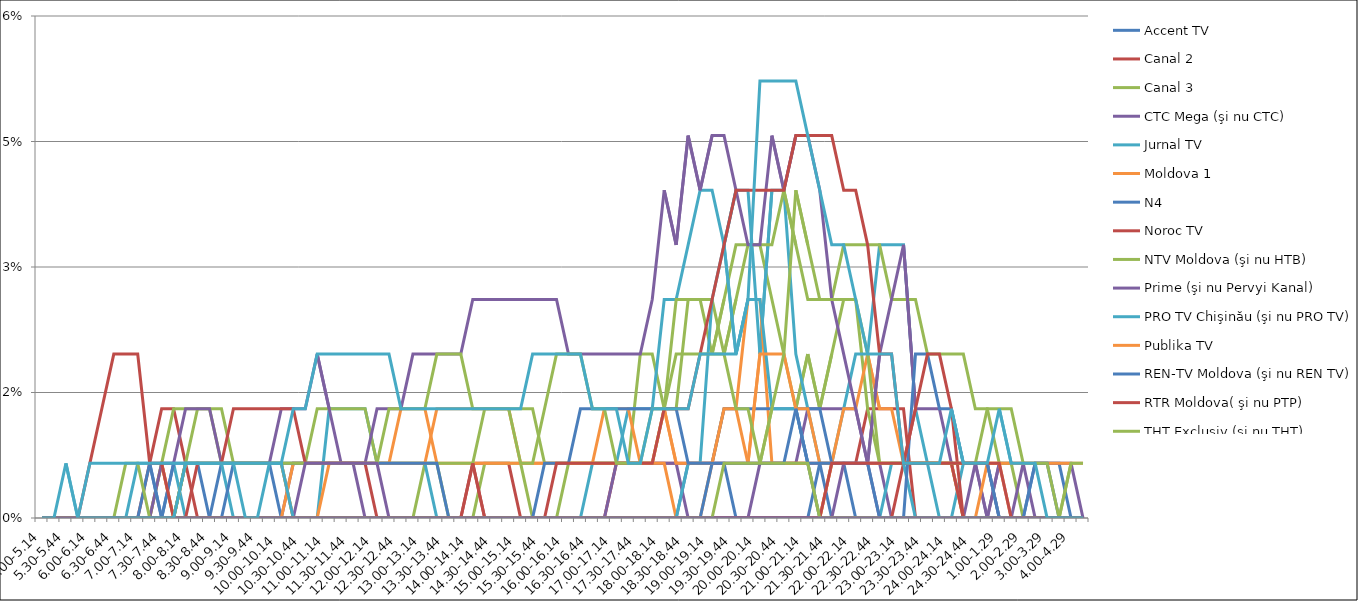
| Category | Accent TV | Canal 2 | Canal 3 | CTC Mega (şi nu CTC) | Jurnal TV | Moldova 1 | N4 | Noroc TV | NTV Moldova (şi nu HTB) | Prime (şi nu Pervyi Kanal) | PRO TV Chişinău (şi nu PRO TV) | Publika TV  | REN-TV Moldova (şi nu REN TV)  | RTR Moldova( şi nu PTP)  | THT Exclusiv (şi nu THT) | TV8 | TVC 21 | TVR MOLDOVA (şi nu TVR) | Canal Regional | Familia Domashniy | ITV | Moldova 2 | Alt canal |
|---|---|---|---|---|---|---|---|---|---|---|---|---|---|---|---|---|---|---|---|---|---|---|---|
| 5.00-5.14 | 0 | 0 | 0 | 0 | 0 | 0 | 0 | 0 | 0 | 0 | 0 | 0 | 0 | 0 | 0 | 0 | 0 | 0 | 0 | 0 | 0 | 0 | 0 |
| 5.15-5.29 | 0 | 0 | 0 | 0 | 0 | 0 | 0 | 0 | 0 | 0 | 0 | 0 | 0 | 0 | 0 | 0 | 0 | 0 | 0 | 0 | 0 | 0 | 0 |
| 5.30-5.44 | 0 | 0 | 0 | 0 | 0 | 0 | 0 | 0 | 0 | 0 | 0 | 0 | 0 | 0 | 0 | 0 | 0 | 0 | 0 | 0 | 0 | 0 | 0.007 |
| 5.45-5.59 | 0 | 0 | 0 | 0 | 0 | 0 | 0 | 0 | 0 | 0 | 0 | 0 | 0 | 0 | 0 | 0 | 0 | 0 | 0 | 0 | 0 | 0 | 0 |
| 6.00-6.14 | 0 | 0 | 0 | 0 | 0 | 0 | 0 | 0 | 0 | 0 | 0 | 0 | 0 | 0.007 | 0 | 0 | 0.007 | 0 | 0 | 0 | 0 | 0 | 0 |
| 6.15-6.29 | 0 | 0 | 0 | 0 | 0 | 0 | 0 | 0 | 0 | 0 | 0 | 0 | 0 | 0.013 | 0 | 0 | 0.007 | 0 | 0 | 0 | 0 | 0 | 0 |
| 6.30-6.44 | 0 | 0 | 0 | 0 | 0 | 0 | 0 | 0 | 0 | 0 | 0 | 0 | 0 | 0.02 | 0 | 0 | 0.007 | 0 | 0 | 0 | 0 | 0 | 0 |
| 6.45-6.59 | 0 | 0 | 0 | 0 | 0 | 0 | 0 | 0 | 0 | 0 | 0 | 0 | 0 | 0.02 | 0.007 | 0 | 0.007 | 0 | 0 | 0 | 0 | 0 | 0 |
| 7.00-7.14 | 0 | 0 | 0 | 0 | 0.007 | 0 | 0 | 0 | 0 | 0 | 0 | 0 | 0 | 0.02 | 0.007 | 0 | 0.007 | 0 | 0 | 0 | 0 | 0 | 0 |
| 7.15-7.29 | 0 | 0.007 | 0 | 0 | 0.007 | 0 | 0 | 0 | 0 | 0 | 0 | 0 | 0.007 | 0.007 | 0 | 0 | 0.007 | 0 | 0 | 0 | 0 | 0 | 0 |
| 7.30-7.44 | 0 | 0.013 | 0 | 0 | 0.007 | 0.007 | 0 | 0 | 0.007 | 0.007 | 0 | 0 | 0 | 0.007 | 0 | 0 | 0.007 | 0 | 0 | 0 | 0 | 0 | 0 |
| 7.45-7.59 | 0 | 0.013 | 0 | 0 | 0.007 | 0 | 0 | 0 | 0.013 | 0.007 | 0 | 0 | 0.007 | 0 | 0 | 0 | 0.007 | 0 | 0 | 0 | 0 | 0 | 0 |
| 8.00-8.14 | 0 | 0.007 | 0.007 | 0 | 0 | 0.007 | 0 | 0 | 0.013 | 0.013 | 0.007 | 0 | 0.007 | 0 | 0.007 | 0 | 0.007 | 0 | 0 | 0 | 0 | 0 | 0.007 |
| 8.15-8.29 | 0 | 0 | 0.013 | 0 | 0 | 0.007 | 0 | 0 | 0.013 | 0.013 | 0.007 | 0 | 0.007 | 0.007 | 0.007 | 0 | 0.007 | 0 | 0 | 0 | 0 | 0 | 0.007 |
| 8.30-8.44 | 0 | 0 | 0.013 | 0 | 0 | 0.007 | 0 | 0 | 0.013 | 0.013 | 0.007 | 0 | 0 | 0.007 | 0.007 | 0 | 0.007 | 0 | 0 | 0 | 0 | 0 | 0.007 |
| 8.45-8.59 | 0 | 0 | 0.007 | 0 | 0 | 0.007 | 0.007 | 0 | 0.013 | 0.007 | 0.007 | 0 | 0 | 0.007 | 0.007 | 0 | 0.007 | 0 | 0 | 0 | 0 | 0 | 0.007 |
| 9.00-9.14 | 0 | 0 | 0.007 | 0 | 0 | 0.007 | 0.007 | 0 | 0.007 | 0.007 | 0 | 0 | 0.007 | 0.013 | 0.007 | 0 | 0.007 | 0 | 0 | 0 | 0 | 0 | 0.007 |
| 9.15-9.29 | 0 | 0 | 0.007 | 0 | 0 | 0.007 | 0.007 | 0 | 0.007 | 0.007 | 0 | 0 | 0.007 | 0.013 | 0.007 | 0 | 0.007 | 0 | 0 | 0 | 0 | 0 | 0 |
| 9.30-9.44 | 0 | 0 | 0.007 | 0 | 0 | 0.007 | 0.007 | 0 | 0.007 | 0.007 | 0 | 0 | 0.007 | 0.013 | 0.007 | 0 | 0.007 | 0 | 0 | 0 | 0 | 0 | 0 |
| 9.45-9.59 | 0 | 0 | 0.007 | 0 | 0 | 0.007 | 0.007 | 0 | 0.007 | 0.007 | 0 | 0 | 0.007 | 0.013 | 0.007 | 0 | 0.007 | 0 | 0 | 0 | 0 | 0 | 0.007 |
| 10.00-10.14 | 0 | 0 | 0.007 | 0 | 0 | 0.007 | 0 | 0 | 0.007 | 0.013 | 0 | 0 | 0.007 | 0.013 | 0.007 | 0 | 0.007 | 0 | 0 | 0 | 0 | 0 | 0.007 |
| 10.15-10.29 | 0 | 0 | 0 | 0.007 | 0 | 0 | 0 | 0 | 0.007 | 0.013 | 0 | 0.007 | 0.007 | 0.013 | 0.007 | 0 | 0 | 0 | 0 | 0 | 0 | 0 | 0.013 |
| 10.30-10.44 | 0 | 0 | 0 | 0.007 | 0 | 0 | 0 | 0 | 0.007 | 0.013 | 0 | 0.007 | 0.007 | 0.007 | 0.007 | 0.007 | 0 | 0 | 0 | 0 | 0 | 0 | 0.013 |
| 10.45-10.59 | 0 | 0 | 0 | 0.007 | 0 | 0 | 0 | 0 | 0.013 | 0.02 | 0 | 0.007 | 0.007 | 0.007 | 0.007 | 0.007 | 0 | 0 | 0 | 0 | 0 | 0 | 0.02 |
| 11.00-11.14 | 0 | 0 | 0 | 0.007 | 0.013 | 0.007 | 0 | 0 | 0.013 | 0.013 | 0 | 0.007 | 0.007 | 0.007 | 0.007 | 0.007 | 0 | 0 | 0 | 0 | 0 | 0 | 0.02 |
| 11.15-11.29 | 0 | 0 | 0 | 0.007 | 0.013 | 0.007 | 0 | 0 | 0.013 | 0.007 | 0 | 0.007 | 0.007 | 0.007 | 0.007 | 0.007 | 0 | 0 | 0 | 0 | 0 | 0 | 0.02 |
| 11.30-11.44 | 0 | 0 | 0 | 0.007 | 0.013 | 0.007 | 0 | 0 | 0.013 | 0.007 | 0 | 0.007 | 0.007 | 0.007 | 0.007 | 0.007 | 0 | 0 | 0 | 0 | 0 | 0 | 0.02 |
| 11.45-11.59 | 0 | 0 | 0 | 0 | 0.013 | 0.007 | 0 | 0 | 0.013 | 0.007 | 0 | 0.007 | 0.007 | 0.007 | 0.007 | 0.007 | 0 | 0 | 0 | 0 | 0 | 0 | 0.02 |
| 12.00-12.14 | 0 | 0 | 0 | 0 | 0.007 | 0.007 | 0 | 0 | 0.007 | 0.013 | 0 | 0.007 | 0.007 | 0 | 0.007 | 0.007 | 0 | 0 | 0 | 0 | 0 | 0 | 0.02 |
| 12.15-12.29 | 0 | 0 | 0 | 0 | 0.007 | 0.007 | 0 | 0 | 0.007 | 0.013 | 0 | 0.007 | 0.007 | 0 | 0.013 | 0 | 0 | 0 | 0 | 0 | 0 | 0 | 0.02 |
| 12.30-12.44 | 0 | 0 | 0 | 0 | 0.007 | 0.013 | 0 | 0 | 0.007 | 0.013 | 0 | 0.007 | 0.007 | 0 | 0.013 | 0 | 0 | 0 | 0 | 0 | 0 | 0 | 0.013 |
| 12.45-12.59 | 0 | 0 | 0 | 0 | 0.007 | 0.013 | 0 | 0 | 0.007 | 0.02 | 0 | 0.007 | 0.007 | 0 | 0.013 | 0 | 0 | 0 | 0 | 0 | 0 | 0 | 0.013 |
| 13.00-13.14 | 0 | 0 | 0.007 | 0 | 0.007 | 0.013 | 0 | 0 | 0.007 | 0.02 | 0 | 0.007 | 0.007 | 0 | 0.013 | 0 | 0 | 0 | 0 | 0 | 0 | 0 | 0.013 |
| 13.15-13.29 | 0 | 0 | 0.007 | 0 | 0 | 0.007 | 0 | 0 | 0.007 | 0.02 | 0 | 0.013 | 0.007 | 0 | 0.02 | 0 | 0 | 0 | 0 | 0 | 0 | 0 | 0.013 |
| 13.30-13.44 | 0 | 0 | 0 | 0 | 0 | 0.007 | 0 | 0 | 0.007 | 0.02 | 0 | 0.013 | 0 | 0 | 0.02 | 0 | 0 | 0 | 0 | 0 | 0 | 0 | 0.013 |
| 13.45-13.59 | 0 | 0 | 0 | 0 | 0 | 0.007 | 0 | 0 | 0.007 | 0.02 | 0 | 0.013 | 0 | 0 | 0.02 | 0 | 0 | 0 | 0 | 0 | 0 | 0 | 0.013 |
| 14.00-14.14 | 0 | 0.007 | 0 | 0 | 0 | 0.007 | 0 | 0 | 0.007 | 0.026 | 0 | 0.013 | 0 | 0.007 | 0.013 | 0 | 0 | 0 | 0 | 0 | 0 | 0 | 0.013 |
| 14.15-14.29 | 0 | 0.007 | 0.007 | 0 | 0 | 0.007 | 0 | 0 | 0.013 | 0.026 | 0 | 0.013 | 0 | 0 | 0.013 | 0 | 0 | 0 | 0 | 0 | 0 | 0 | 0.013 |
| 14.30-14.44 | 0 | 0.007 | 0.007 | 0 | 0 | 0.007 | 0 | 0 | 0.013 | 0.026 | 0 | 0.013 | 0 | 0 | 0.013 | 0 | 0 | 0 | 0 | 0 | 0 | 0 | 0.013 |
| 14.45-14.59 | 0 | 0.007 | 0.007 | 0 | 0 | 0.007 | 0 | 0 | 0.013 | 0.026 | 0 | 0.013 | 0 | 0 | 0.013 | 0 | 0 | 0 | 0 | 0 | 0 | 0 | 0.013 |
| 15.00-15.14 | 0 | 0 | 0.007 | 0 | 0 | 0.007 | 0 | 0 | 0.013 | 0.026 | 0 | 0.007 | 0 | 0 | 0.007 | 0 | 0 | 0 | 0 | 0 | 0 | 0 | 0.013 |
| 15.15-15.29 | 0 | 0 | 0 | 0 | 0 | 0.007 | 0 | 0 | 0.013 | 0.026 | 0 | 0.007 | 0 | 0 | 0.007 | 0 | 0 | 0 | 0 | 0 | 0 | 0 | 0.02 |
| 15.30-15.44 | 0 | 0 | 0 | 0 | 0 | 0.007 | 0 | 0 | 0.007 | 0.026 | 0 | 0.007 | 0.007 | 0 | 0.013 | 0 | 0 | 0 | 0 | 0 | 0 | 0 | 0.02 |
| 15.45-15.59 | 0 | 0 | 0 | 0 | 0 | 0.007 | 0 | 0 | 0.007 | 0.026 | 0 | 0.007 | 0.007 | 0.007 | 0.02 | 0 | 0 | 0 | 0 | 0 | 0 | 0 | 0.02 |
| 16.00-16.14 | 0 | 0 | 0.007 | 0 | 0 | 0.007 | 0 | 0 | 0.007 | 0.02 | 0 | 0.007 | 0.007 | 0.007 | 0.02 | 0 | 0 | 0 | 0 | 0 | 0 | 0 | 0.02 |
| 16.15-16.29 | 0 | 0 | 0.007 | 0 | 0 | 0.007 | 0 | 0 | 0.007 | 0.02 | 0 | 0.007 | 0.013 | 0.007 | 0.02 | 0 | 0 | 0 | 0 | 0 | 0 | 0 | 0.02 |
| 16.30-16.44 | 0 | 0 | 0.007 | 0 | 0.007 | 0.007 | 0 | 0 | 0.007 | 0.02 | 0 | 0.007 | 0.013 | 0.007 | 0.013 | 0 | 0 | 0 | 0 | 0 | 0 | 0 | 0.013 |
| 16.45-16.59 | 0 | 0 | 0.007 | 0 | 0.007 | 0.013 | 0 | 0 | 0.007 | 0.02 | 0 | 0.007 | 0.013 | 0.007 | 0.013 | 0 | 0 | 0 | 0 | 0 | 0 | 0 | 0.013 |
| 17.00-17.14 | 0 | 0.007 | 0.007 | 0.007 | 0.007 | 0.013 | 0 | 0 | 0.007 | 0.02 | 0 | 0.007 | 0.013 | 0.007 | 0.007 | 0 | 0 | 0 | 0 | 0 | 0 | 0 | 0.013 |
| 17.15-17.29 | 0 | 0.007 | 0.007 | 0.007 | 0.013 | 0.013 | 0 | 0 | 0.007 | 0.02 | 0 | 0.007 | 0.013 | 0.007 | 0.007 | 0 | 0 | 0 | 0 | 0 | 0 | 0 | 0.007 |
| 17.30-17.44 | 0 | 0.007 | 0.02 | 0.007 | 0.013 | 0.007 | 0 | 0 | 0.007 | 0.02 | 0 | 0.007 | 0.013 | 0.007 | 0.007 | 0 | 0 | 0 | 0 | 0 | 0 | 0 | 0.007 |
| 17.45-17.59 | 0 | 0.007 | 0.02 | 0.007 | 0.013 | 0.007 | 0 | 0 | 0.007 | 0.026 | 0 | 0.007 | 0.013 | 0.007 | 0.013 | 0 | 0 | 0 | 0 | 0 | 0 | 0 | 0.013 |
| 18.00-18.14 | 0 | 0.007 | 0.013 | 0.007 | 0.026 | 0.007 | 0 | 0 | 0.013 | 0.039 | 0 | 0.013 | 0.013 | 0.013 | 0.013 | 0 | 0 | 0 | 0 | 0 | 0 | 0 | 0.013 |
| 18.15-18.29 | 0 | 0.007 | 0.013 | 0.007 | 0.026 | 0 | 0 | 0 | 0.026 | 0.033 | 0 | 0.007 | 0.013 | 0.013 | 0.02 | 0 | 0 | 0 | 0 | 0 | 0 | 0 | 0.013 |
| 18.30-18.44 | 0.007 | 0.007 | 0.026 | 0 | 0.033 | 0 | 0 | 0 | 0.026 | 0.046 | 0.007 | 0.007 | 0.007 | 0.013 | 0.02 | 0 | 0 | 0 | 0 | 0 | 0 | 0 | 0.013 |
| 18.45-18.59 | 0.007 | 0.007 | 0.026 | 0 | 0.039 | 0 | 0 | 0 | 0.026 | 0.039 | 0.007 | 0.007 | 0.007 | 0.02 | 0.02 | 0 | 0 | 0 | 0 | 0 | 0 | 0 | 0.02 |
| 19.00-19.14 | 0.007 | 0.007 | 0.026 | 0 | 0.039 | 0.007 | 0.007 | 0 | 0.02 | 0.046 | 0.026 | 0.007 | 0.007 | 0.026 | 0.02 | 0 | 0 | 0 | 0 | 0 | 0 | 0 | 0.02 |
| 19.15-19.29 | 0.007 | 0.007 | 0.02 | 0 | 0.033 | 0.013 | 0.013 | 0 | 0.026 | 0.046 | 0.033 | 0.013 | 0.007 | 0.033 | 0.02 | 0 | 0 | 0 | 0 | 0 | 0.007 | 0 | 0.02 |
| 19.30-19.44 | 0 | 0.007 | 0.026 | 0 | 0.039 | 0.013 | 0.013 | 0 | 0.033 | 0.039 | 0.02 | 0.013 | 0.007 | 0.039 | 0.013 | 0 | 0 | 0 | 0 | 0 | 0.007 | 0 | 0.02 |
| 19.45-19.59 | 0 | 0.007 | 0.033 | 0 | 0.039 | 0.026 | 0.013 | 0 | 0.033 | 0.033 | 0.026 | 0.007 | 0.007 | 0.039 | 0.013 | 0 | 0 | 0 | 0 | 0 | 0.007 | 0 | 0.026 |
| 20.00-20.14 | 0 | 0.007 | 0.033 | 0.007 | 0.02 | 0.026 | 0.013 | 0 | 0.033 | 0.033 | 0.026 | 0.02 | 0.007 | 0.039 | 0.007 | 0 | 0 | 0 | 0 | 0 | 0.007 | 0 | 0.052 |
| 20.15-20.29 | 0 | 0.007 | 0.026 | 0.007 | 0.039 | 0.007 | 0.013 | 0 | 0.033 | 0.046 | 0.013 | 0.02 | 0.007 | 0.039 | 0.013 | 0 | 0 | 0 | 0 | 0 | 0.007 | 0 | 0.052 |
| 20.30-20.44 | 0 | 0.007 | 0.02 | 0.007 | 0.039 | 0.007 | 0.013 | 0 | 0.039 | 0.039 | 0.013 | 0.02 | 0.007 | 0.039 | 0.02 | 0 | 0 | 0 | 0 | 0 | 0.007 | 0 | 0.052 |
| 20.45-20.59 | 0 | 0.007 | 0.013 | 0.007 | 0.02 | 0.007 | 0.013 | 0 | 0.033 | 0.046 | 0.013 | 0.013 | 0.013 | 0.046 | 0.039 | 0 | 0 | 0 | 0 | 0 | 0.007 | 0 | 0.052 |
| 21.00-21.14 | 0 | 0.007 | 0.02 | 0.013 | 0.013 | 0.007 | 0.013 | 0 | 0.026 | 0.046 | 0.007 | 0.013 | 0.007 | 0.046 | 0.033 | 0 | 0 | 0 | 0 | 0 | 0.007 | 0 | 0.046 |
| 21.15-21.29 | 0 | 0.007 | 0.013 | 0.013 | 0.007 | 0 | 0.013 | 0 | 0.026 | 0.039 | 0 | 0.007 | 0.007 | 0.046 | 0.026 | 0 | 0 | 0 | 0.007 | 0 | 0 | 0 | 0.039 |
| 21.30-21.44 | 0 | 0.007 | 0.02 | 0.013 | 0.007 | 0.007 | 0.007 | 0 | 0.026 | 0.026 | 0 | 0.007 | 0 | 0.046 | 0.026 | 0 | 0 | 0 | 0.007 | 0.007 | 0 | 0 | 0.033 |
| 21.45-21.59 | 0 | 0.007 | 0.026 | 0.013 | 0.013 | 0.013 | 0.007 | 0 | 0.033 | 0.02 | 0 | 0.007 | 0 | 0.039 | 0.026 | 0.007 | 0 | 0 | 0.007 | 0.007 | 0 | 0 | 0.033 |
| 22.00-22.14 | 0 | 0.007 | 0.026 | 0.013 | 0.02 | 0.013 | 0 | 0 | 0.033 | 0.013 | 0 | 0.007 | 0 | 0.039 | 0.026 | 0.007 | 0 | 0 | 0.007 | 0.007 | 0 | 0 | 0.026 |
| 22.15-22.29 | 0 | 0.013 | 0.013 | 0.007 | 0.02 | 0.02 | 0 | 0 | 0.033 | 0.007 | 0 | 0.007 | 0 | 0.033 | 0.02 | 0.007 | 0 | 0 | 0.007 | 0.007 | 0 | 0 | 0.02 |
| 22.30-22.44 | 0 | 0.013 | 0.007 | 0.007 | 0.033 | 0.013 | 0 | 0 | 0.033 | 0.02 | 0 | 0.007 | 0 | 0.02 | 0.007 | 0 | 0 | 0 | 0 | 0.007 | 0 | 0 | 0.02 |
| 22.45-22.59 | 0 | 0.013 | 0.007 | 0 | 0.033 | 0.013 | 0 | 0 | 0.026 | 0.026 | 0.007 | 0.007 | 0 | 0.02 | 0.007 | 0 | 0 | 0 | 0 | 0.007 | 0 | 0 | 0.02 |
| 23.00-23.14 | 0 | 0.013 | 0.007 | 0 | 0.033 | 0.007 | 0 | 0.007 | 0.026 | 0.033 | 0.007 | 0.007 | 0 | 0.007 | 0.007 | 0 | 0 | 0 | 0 | 0.007 | 0 | 0 | 0.007 |
| 23.15-23.29 | 0 | 0 | 0.007 | 0 | 0.013 | 0.007 | 0 | 0.007 | 0.026 | 0.013 | 0 | 0.007 | 0.02 | 0.013 | 0.007 | 0 | 0 | 0 | 0 | 0.007 | 0 | 0 | 0.007 |
| 23.30-23.44 | 0 | 0 | 0.007 | 0 | 0.007 | 0.007 | 0 | 0.007 | 0.02 | 0.013 | 0 | 0.007 | 0.02 | 0.02 | 0.007 | 0 | 0 | 0 | 0 | 0.007 | 0 | 0 | 0.007 |
| 23.45-23.59 | 0 | 0 | 0.007 | 0 | 0 | 0.007 | 0 | 0.007 | 0.02 | 0.013 | 0 | 0.007 | 0.013 | 0.02 | 0.007 | 0 | 0 | 0 | 0 | 0.007 | 0 | 0 | 0.007 |
| 24.00-24.14 | 0 | 0 | 0.007 | 0 | 0 | 0.007 | 0 | 0.007 | 0.02 | 0.007 | 0 | 0.007 | 0.013 | 0.013 | 0.007 | 0 | 0 | 0 | 0 | 0.007 | 0 | 0 | 0.013 |
| 24.15-24.29 | 0 | 0 | 0 | 0 | 0.007 | 0 | 0 | 0 | 0.02 | 0.007 | 0 | 0.007 | 0.007 | 0 | 0.007 | 0 | 0 | 0 | 0 | 0.007 | 0 | 0 | 0.007 |
| 24.30-24.44 | 0 | 0 | 0 | 0.007 | 0.007 | 0 | 0 | 0 | 0.013 | 0.007 | 0 | 0.007 | 0.007 | 0 | 0.007 | 0 | 0 | 0 | 0 | 0.007 | 0 | 0 | 0.007 |
| 24.45-24.59 | 0 | 0 | 0 | 0 | 0.007 | 0.007 | 0 | 0 | 0.013 | 0.007 | 0 | 0.007 | 0.007 | 0 | 0.013 | 0 | 0 | 0 | 0 | 0.007 | 0 | 0 | 0.007 |
| 1.00-1.29 | 0 | 0 | 0 | 0.007 | 0 | 0.007 | 0 | 0 | 0.007 | 0 | 0 | 0.007 | 0 | 0 | 0.013 | 0 | 0 | 0 | 0 | 0.007 | 0 | 0 | 0.013 |
| 1.30-1. 59 | 0 | 0 | 0 | 0.007 | 0 | 0 | 0 | 0 | 0.007 | 0 | 0 | 0.007 | 0 | 0 | 0.013 | 0 | 0 | 0 | 0 | 0 | 0 | 0 | 0.007 |
| 2.00-2.29 | 0 | 0 | 0 | 0.007 | 0 | 0 | 0 | 0 | 0 | 0.007 | 0 | 0.007 | 0 | 0 | 0.007 | 0 | 0 | 0 | 0 | 0 | 0 | 0 | 0.007 |
| 2.30-2.59 | 0 | 0 | 0 | 0 | 0 | 0 | 0.007 | 0 | 0 | 0.007 | 0 | 0.007 | 0.007 | 0 | 0.007 | 0 | 0 | 0 | 0 | 0 | 0 | 0 | 0.007 |
| 3.00-3.29 | 0 | 0 | 0 | 0 | 0 | 0 | 0.007 | 0 | 0 | 0.007 | 0 | 0.007 | 0.007 | 0 | 0.007 | 0 | 0 | 0 | 0 | 0 | 0 | 0 | 0 |
| 3.30-3.59 | 0 | 0 | 0 | 0 | 0 | 0 | 0.007 | 0 | 0 | 0.007 | 0 | 0.007 | 0 | 0 | 0 | 0 | 0 | 0 | 0 | 0 | 0 | 0 | 0 |
| 4.00-4.29 | 0 | 0 | 0 | 0 | 0 | 0 | 0 | 0 | 0 | 0.007 | 0 | 0.007 | 0 | 0 | 0.007 | 0 | 0 | 0 | 0 | 0 | 0 | 0 | 0 |
| 4.30-4.59 | 0 | 0 | 0 | 0 | 0 | 0 | 0 | 0 | 0 | 0 | 0 | 0.007 | 0 | 0 | 0.007 | 0 | 0 | 0 | 0 | 0 | 0 | 0 | 0 |